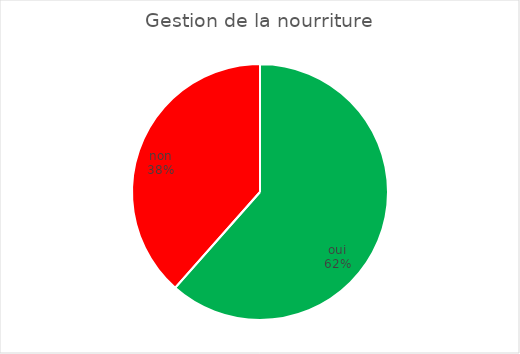
| Category | Gestion de la nourriture |
|---|---|
| oui | 8 |
| non | 5 |